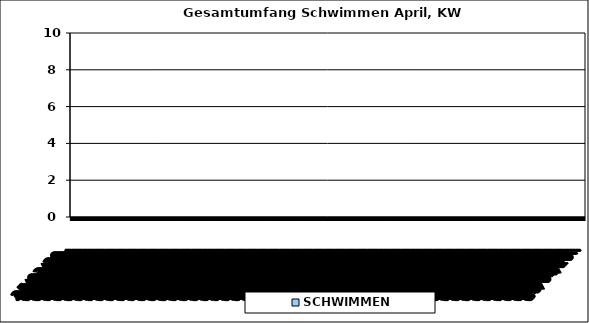
| Category | SCHWIMMEN |
|---|---|
| 27/03/2023 | 0 |
| 28/03/2023 | 0 |
| 29/03/2023 | 0 |
| 30/03/2023 | 0 |
| 31/03/2023 | 0 |
| 01/04/2023 | 0 |
| 02/04/2023 | 0 |
| 03/04/2023 | 0 |
| 04/04/2023 | 0 |
| 05/04/2023 | 0 |
| 06/04/2023 | 0 |
| 07/04/2023 | 0 |
| 08/04/2023 | 0 |
| 09/04/2023 | 0 |
| 10/04/2023 | 0 |
| 11/04/2023 | 0 |
| 12/04/2023 | 0 |
| 13/04/2023 | 0 |
| 14/04/2023 | 0 |
| 15/04/2023 | 0 |
| 16/04/2023 | 0 |
| 17/04/2023 | 0 |
| 18/04/2023 | 0 |
| 19/04/2023 | 0 |
| 20/04/2023 | 0 |
| 21/04/2023 | 0 |
| 22/04/2023 | 0 |
| 23/04/2023 | 0 |
| 24/04/2023 | 0 |
| 25/04/2023 | 0 |
| 26/04/2023 | 0 |
| 27/04/2023 | 0 |
| 28/04/2023 | 0 |
| 29/04/2023 | 0 |
| 30/04/2023 | 0 |